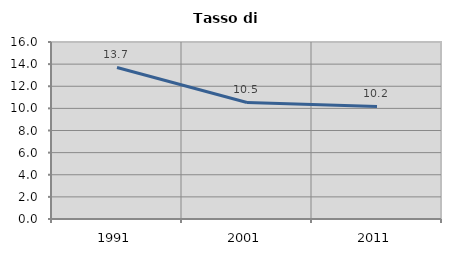
| Category | Tasso di disoccupazione   |
|---|---|
| 1991.0 | 13.701 |
| 2001.0 | 10.536 |
| 2011.0 | 10.178 |